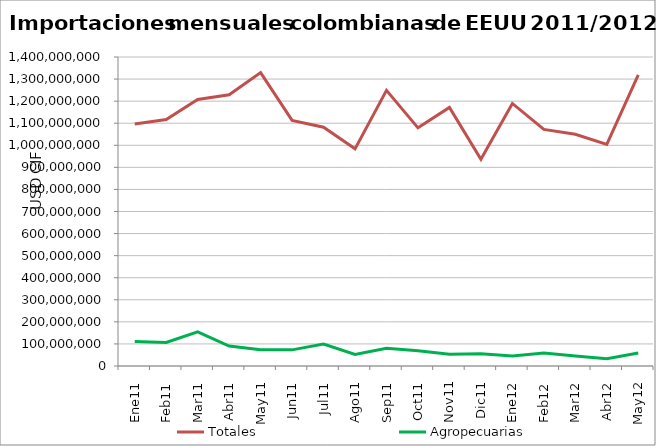
| Category | Totales | Agropecuarias |
|---|---|---|
| 0 | 1096573432.67 | 110873807.57 |
| 1 | 1116827967.7 | 106541093 |
| 2 | 1207611145.24 | 154875220.72 |
| 3 | 1228593617.79 | 90448562.91 |
| 4 | 1329185657.56 | 73545411.55 |
| 5 | 1112850981.19 | 73149355.27 |
| 6 | 1081734647.48 | 99105700.13 |
| 7 | 983823036.37 | 52055194.11 |
| 8 | 1249083768.62 | 79852744.17 |
| 9 | 1079027571.65 | 68688188.48 |
| 10 | 1171619158.82 | 53671662.71 |
| 11 | 936650169.29 | 55124961.82 |
| 12 | 1189511680.79 | 45863310 |
| 13 | 1072056937.03 | 59220981 |
| 14 | 1049688546.32 | 45692386.47 |
| 15 | 1004044482.74 | 32415346.99 |
| 16 | 1318729624.07 | 58490565.91 |